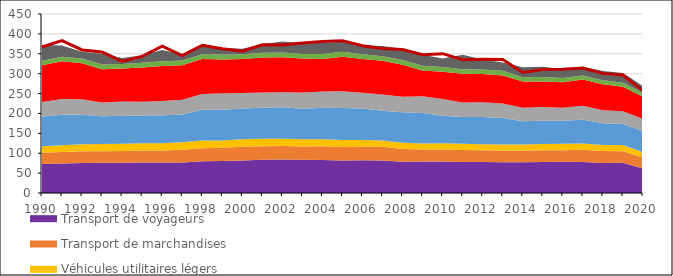
| Category | Note : les émissions de CO2 liées à la production d’électricité et de chaleur sont réaffectées aux secteurs consommateurs. |
|---|---|
| 1990.0 | 367.072 |
| 1991.0 | 382.973 |
| 1992.0 | 359.661 |
| 1993.0 | 354.728 |
| 1994.0 | 330.918 |
| 1995.0 | 343.369 |
| 1996.0 | 369.326 |
| 1997.0 | 345.381 |
| 1998.0 | 371.386 |
| 1999.0 | 362.652 |
| 2000.0 | 356.708 |
| 2001.0 | 372.502 |
| 2002.0 | 371.963 |
| 2003.0 | 377.251 |
| 2004.0 | 380.602 |
| 2005.0 | 382.627 |
| 2006.0 | 370.11 |
| 2007.0 | 363.368 |
| 2008.0 | 360.897 |
| 2009.0 | 347.803 |
| 2010.0 | 350.252 |
| 2011.0 | 335.052 |
| 2012.0 | 336.014 |
| 2013.0 | 335.373 |
| 2014.0 | 303.027 |
| 2015.0 | 310.614 |
| 2016.0 | 311.316 |
| 2017.0 | 314.224 |
| 2018.0 | 300.743 |
| 2019.0 | 296.509 |
| 2020.0 | 257.456 |